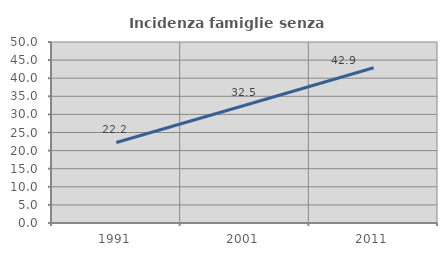
| Category | Incidenza famiglie senza nuclei |
|---|---|
| 1991.0 | 22.24 |
| 2001.0 | 32.534 |
| 2011.0 | 42.878 |